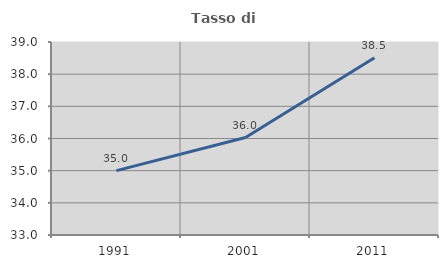
| Category | Tasso di occupazione   |
|---|---|
| 1991.0 | 35 |
| 2001.0 | 36.03 |
| 2011.0 | 38.512 |